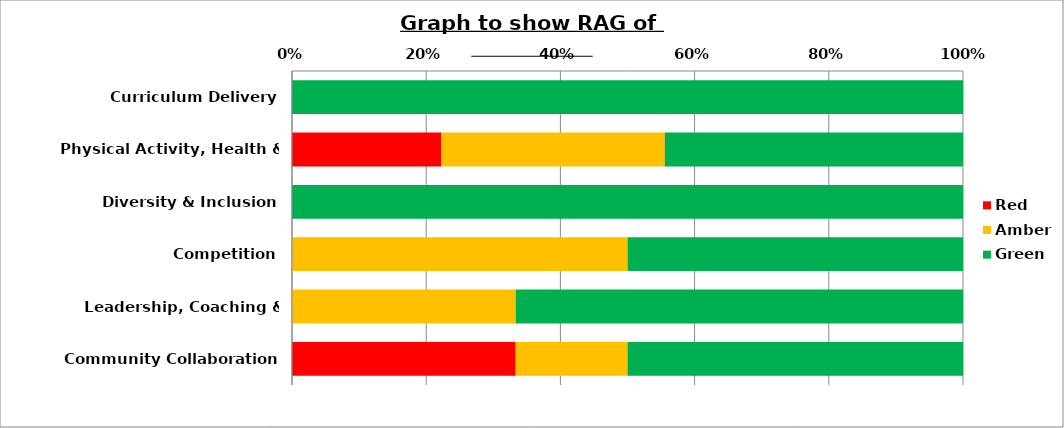
| Category | Red | Amber | Green |
|---|---|---|---|
| Curriculum Delivery | 0 | 0 | 100 |
| Physical Activity, Health & Wellbeing | 22.222 | 33.333 | 44.444 |
| Diversity & Inclusion | 0 | 0 | 100 |
| Competition | 0 | 50 | 50 |
| Leadership, Coaching & Volunteering | 0 | 33.333 | 66.667 |
| Community Collaboration | 33.333 | 16.667 | 50 |